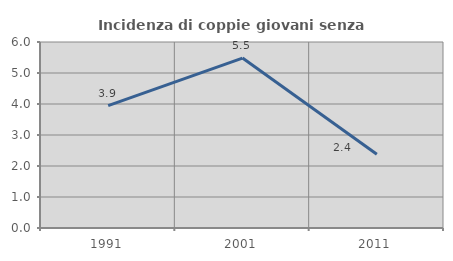
| Category | Incidenza di coppie giovani senza figli |
|---|---|
| 1991.0 | 3.947 |
| 2001.0 | 5.481 |
| 2011.0 | 2.378 |